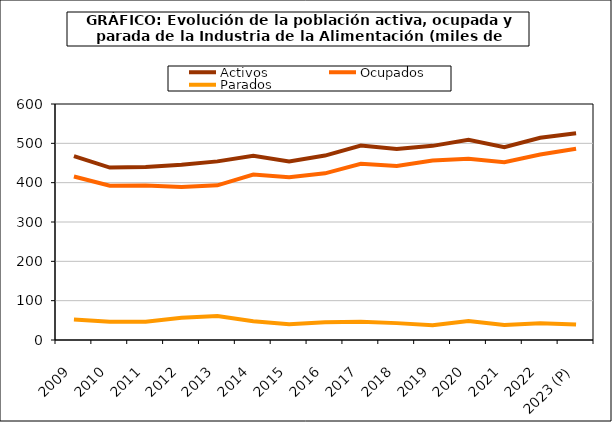
| Category | Activos | Ocupados | Parados |
|---|---|---|---|
| 2009 | 467.6 | 415.6 | 52 |
| 2010 | 438.425 | 392.275 | 46.15 |
| 2011 | 439.6 | 393.1 | 46.5 |
| 2012 | 445.725 | 388.925 | 56.8 |
| 2013 | 454.1 | 393.3 | 60.8 |
| 2014 | 468.5 | 420.7 | 47.8 |
| 2015 | 454.1 | 414 | 40.1 |
| 2016 | 468.925 | 423.675 | 45.25 |
| 2017 | 494.275 | 448.025 | 46.25 |
| 2018 | 485.3 | 442.4 | 42.9 |
| 2019 | 493.6 | 456.1 | 37.5 |
| 2020 | 508.9 | 460.5 | 48.4 |
| 2021 | 490.375 | 452 | 38.375 |
| 2022 | 514.275 | 471.5 | 42.775 |
| 2023 (P) | 525.475 | 486.325 | 39.15 |